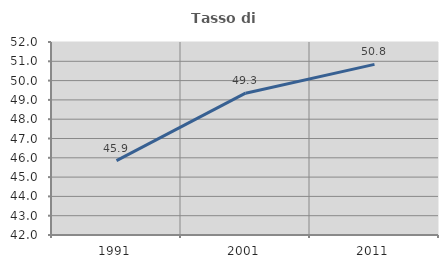
| Category | Tasso di occupazione   |
|---|---|
| 1991.0 | 45.856 |
| 2001.0 | 49.349 |
| 2011.0 | 50.841 |